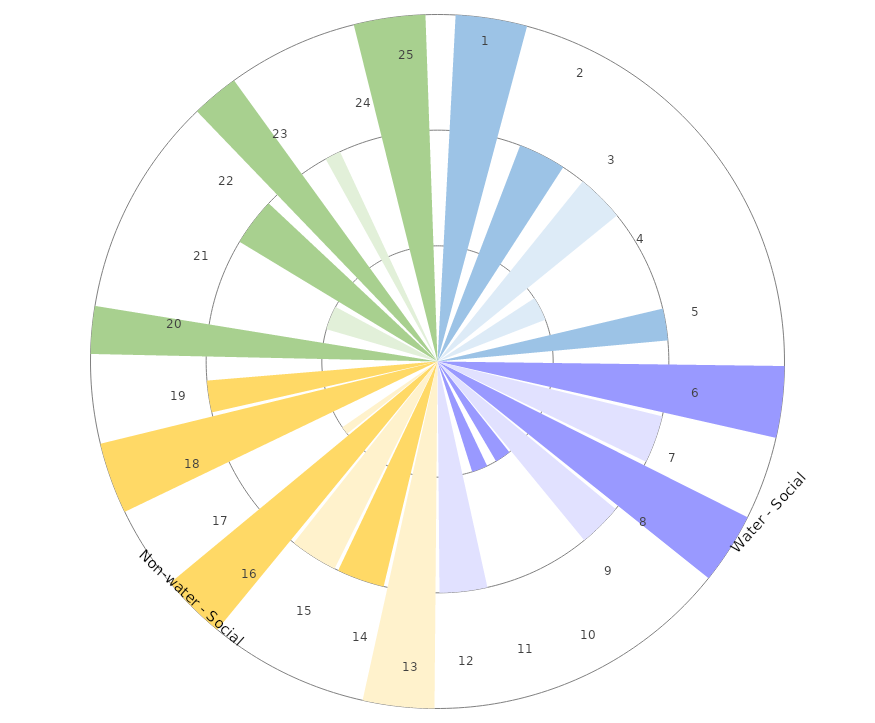
| Category | Sector size |
|---|---|
| Hydrology | 18 |
| Water quality | 18 |
| Aquatic habitat quality | 18 |
| Drainage network and aquatic ecosystem connectivity | 18 |
| Natural character (water bodies) | 18 |
| Supplementary water supply | 12.857 |
| Reduced wastewater/CSO loading | 12.857 |
| Drainage & flood management | 12.857 |
| Climate change adaptation | 12.857 |
| Recreation | 12.857 |
| Provisioning (e.g. fishing) | 12.857 |
| Connectedness with nature (water bodies) | 12.857 |
| Property values | 12.857 |
| Community health and wellbeing | 12.857 |
| Connectedness with nature (land) | 12.857 |
| Public safety | 12.857 |
| Food & fibre production | 12.857 |
| Infrastructure resilience | 12.857 |
| Reduced building material consumption | 12.857 |
| Natural character (land) | 15 |
| Terrestrial ecosystem connectivity | 15 |
| Terrestrial habitat quality | 15 |
| Carbon sequestration and mitigation | 15 |
| Microclimate management (UV, temperature, air quality) | 15 |
| Preservation of natural soils | 15 |